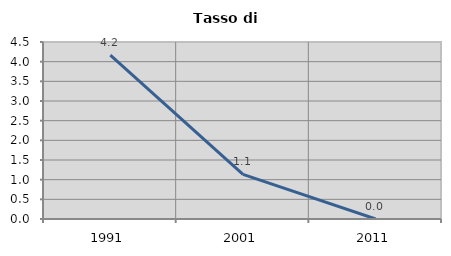
| Category | Tasso di disoccupazione   |
|---|---|
| 1991.0 | 4.167 |
| 2001.0 | 1.136 |
| 2011.0 | 0 |